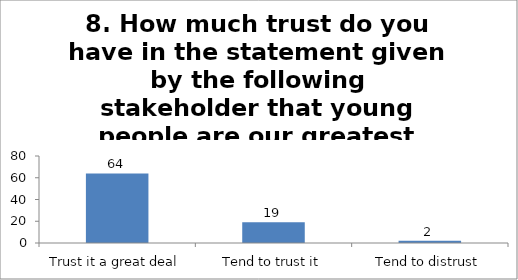
| Category | 8. How much trust do you have in the statement given by the following stakeholder that young people are our greatest assets to rebuild Pakistan?(Parents) |
|---|---|
| Trust it a great deal | 64 |
| Tend to trust it | 19 |
| Tend to distrust | 2 |